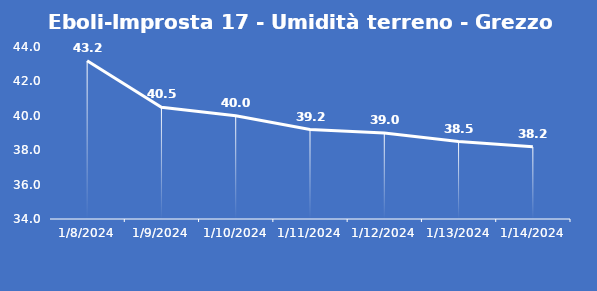
| Category | Eboli-Improsta 17 - Umidità terreno - Grezzo (%VWC) |
|---|---|
| 1/8/24 | 43.2 |
| 1/9/24 | 40.5 |
| 1/10/24 | 40 |
| 1/11/24 | 39.2 |
| 1/12/24 | 39 |
| 1/13/24 | 38.5 |
| 1/14/24 | 38.2 |